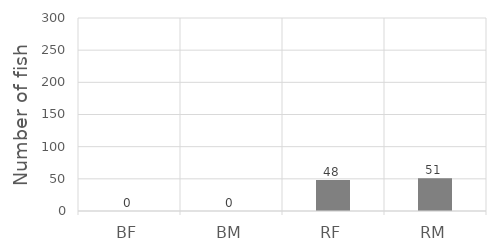
| Category | Series 0 |
|---|---|
| BF | 0 |
| BM | 0 |
| RF | 48 |
| RM | 51 |